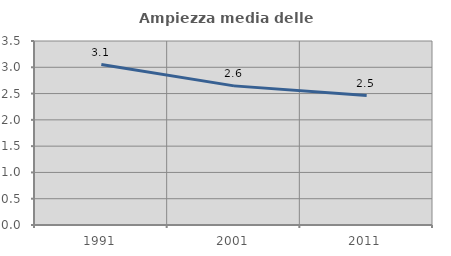
| Category | Ampiezza media delle famiglie |
|---|---|
| 1991.0 | 3.052 |
| 2001.0 | 2.646 |
| 2011.0 | 2.463 |